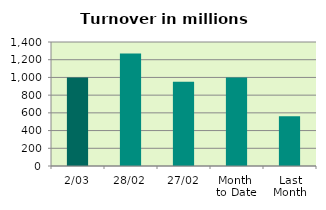
| Category | Series 0 |
|---|---|
| 2/03 | 1000.37 |
| 28/02 | 1270.533 |
| 27/02 | 952.023 |
| Month 
to Date | 1000.37 |
| Last
Month | 561.452 |